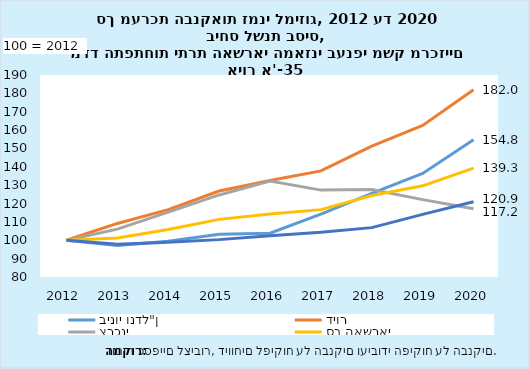
| Category | בינוי ונדל"ן | דיור | צרכני | סך האשראי | עסקי (ללא בינוי ונדל"ן) |
|---|---|---|---|---|---|
| 2012.0 | 100 | 100 | 100 | 100 | 100 |
| 2013.0 | 97.212 | 109.166 | 106.082 | 101.251 | 97.864 |
| 2014.0 | 99.481 | 116.712 | 115.341 | 105.815 | 98.92 |
| 2015.0 | 103.266 | 126.803 | 124.688 | 111.382 | 100.354 |
| 2016.0 | 103.862 | 132.534 | 132.306 | 114.29 | 102.509 |
| 2017.0 | 114.279 | 137.788 | 127.312 | 116.689 | 104.365 |
| 2018.0 | 125.544 | 151.212 | 127.646 | 124.367 | 106.882 |
| 2019.0 | 136.356 | 162.548 | 122.132 | 129.659 | 114.078 |
| 2020.0 | 154.766 | 182.018 | 117.218 | 139.326 | 120.948 |